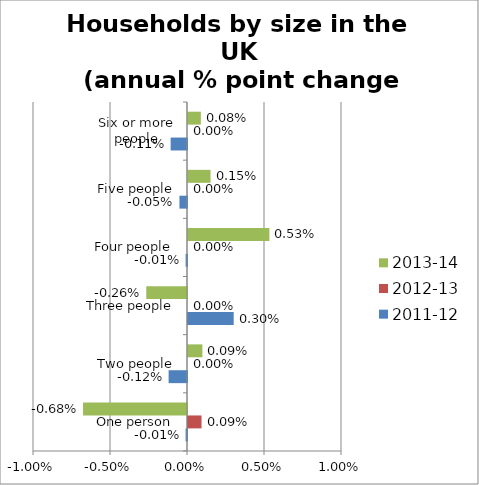
| Category | 2011-12 | 2012-13 | 2013-14 |
|---|---|---|---|
| One person | 0 | 0.001 | -0.007 |
| Two people | -0.001 | 0 | 0.001 |
| Three people | 0.003 | 0 | -0.003 |
| Four people | 0 | 0 | 0.005 |
| Five people | 0 | 0 | 0.001 |
| Six or more people | -0.001 | 0 | 0.001 |